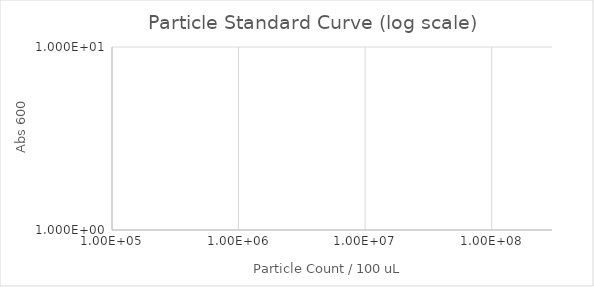
| Category | Series 1 |
|---|---|
| 300000000.0 | 0 |
| 150000000.0 | 0 |
| 75000000.0 | 0 |
| 37500000.0 | 0 |
| 18750000.0 | 0 |
| 9375000.0 | 0 |
| 4687500.0 | 0 |
| 2343750.0 | 0 |
| 1171875.0 | 0 |
| 585937.5 | 0 |
| 292968.75 | 0 |